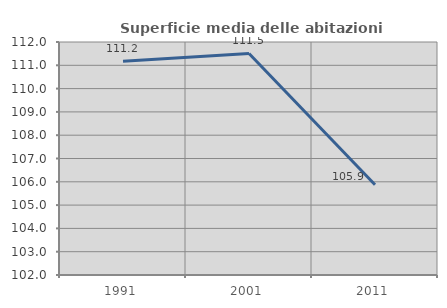
| Category | Superficie media delle abitazioni occupate |
|---|---|
| 1991.0 | 111.174 |
| 2001.0 | 111.508 |
| 2011.0 | 105.876 |